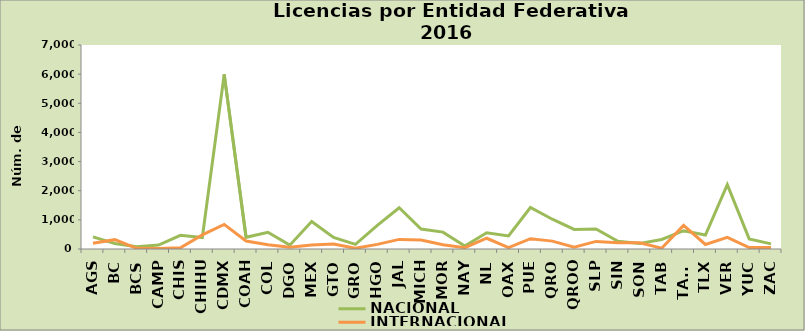
| Category | NACIONAL | INTERNACIONAL |
|---|---|---|
| AGS | 414 | 198 |
| BC | 191 | 321 |
| BCS | 74 | 23 |
| CAMP | 134 | 18 |
| CHIS | 471 | 42 |
| CHIHU | 395 | 486 |
| CDMX | 5992 | 844 |
| COAH | 401 | 275 |
| COL | 575 | 143 |
| DGO | 132 | 62 |
| MEX | 944 | 140 |
| GTO | 397 | 168 |
| GRO | 159 | 24 |
| HGO | 810 | 159 |
| JAL | 1415 | 329 |
| MICH | 685 | 309 |
| MOR | 579 | 149 |
| NAY | 104 | 44 |
| NL | 555 | 369 |
| OAX | 448 | 49 |
| PUE | 1424 | 354 |
| QRO | 1022 | 271 |
| QROO | 671 | 58 |
| SLP | 690 | 261 |
| SIN | 264 | 214 |
| SON | 192 | 217 |
| TAB | 328 | 27 |
| TAMS | 627 | 811 |
| TLX | 478 | 155 |
| VER | 2208 | 399 |
| YUC | 348 | 49 |
| ZAC | 177 | 55 |